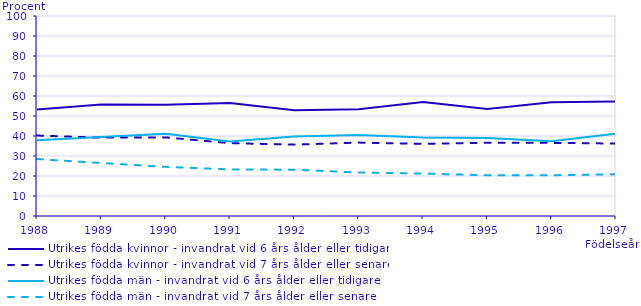
| Category | Utrikes födda kvinnor - invandrat vid 6 års ålder eller tidigare | Utrikes födda kvinnor - invandrat vid 7 års ålder eller senare | Utrikes födda män - invandrat vid 6 års ålder eller tidigare | Utrikes födda män - invandrat vid 7 års ålder eller senare |
|---|---|---|---|---|
| 1988 | 53.268 | 40.241 | 37.932 | 28.477 |
| 1989 | 55.711 | 39.175 | 39.457 | 26.498 |
| 1990 | 55.619 | 39.308 | 41.064 | 24.569 |
| 1991 | 56.543 | 36.421 | 37.272 | 23.283 |
| 1992 | 52.874 | 35.687 | 39.694 | 23.15 |
| 1993 | 53.405 | 36.707 | 40.456 | 21.748 |
| 1994 | 57.005 | 36.08 | 39.237 | 21.206 |
| 1995 | 53.565 | 36.627 | 38.967 | 20.369 |
| 1996 | 56.931 | 36.567 | 37.349 | 20.371 |
| 1997 | 57.269 | 36.229 | 41.149 | 20.923 |